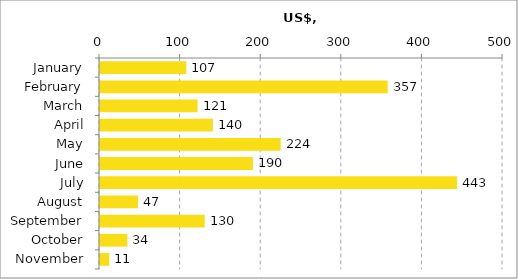
| Category | Series 0 |
|---|---|
| January | 107.046 |
| February | 356.961 |
| March | 121.098 |
| April | 140.05 |
| May | 224.19 |
| June | 189.739 |
| July | 442.871 |
| August | 47.138 |
| September | 129.966 |
| October | 33.924 |
| November | 11.451 |